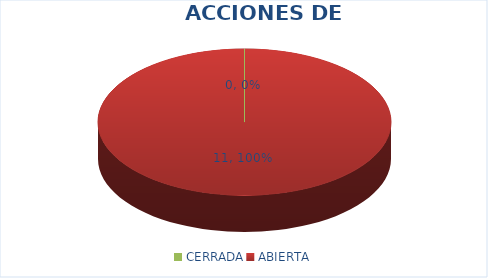
| Category | Series 0 |
|---|---|
| CERRADA | 0 |
| ABIERTA | 11 |